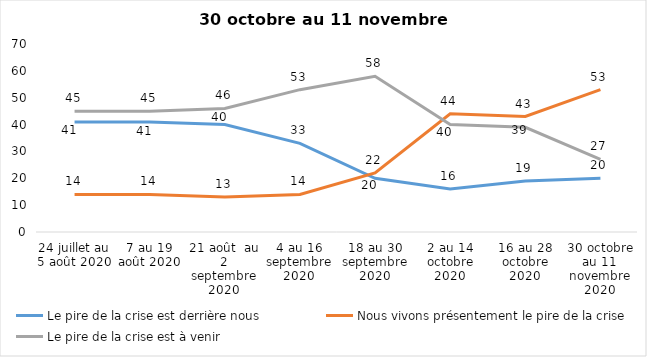
| Category | Le pire de la crise est derrière nous | Nous vivons présentement le pire de la crise | Le pire de la crise est à venir |
|---|---|---|---|
| 24 juillet au 5 août 2020 | 41 | 14 | 45 |
| 7 au 19 août 2020 | 41 | 14 | 45 |
| 21 août  au 2 septembre 2020 | 40 | 13 | 46 |
| 4 au 16 septembre 2020 | 33 | 14 | 53 |
| 18 au 30 septembre 2020 | 20 | 22 | 58 |
| 2 au 14 octobre 2020 | 16 | 44 | 40 |
| 16 au 28 octobre 2020 | 19 | 43 | 39 |
| 30 octobre au 11 novembre 2020 | 20 | 53 | 27 |